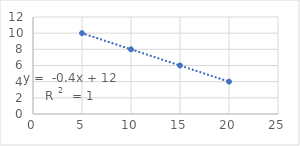
| Category | Y |
|---|---|
| 5.0 | 10 |
| 10.0 | 8 |
| 15.0 | 6 |
| 20.0 | 4 |